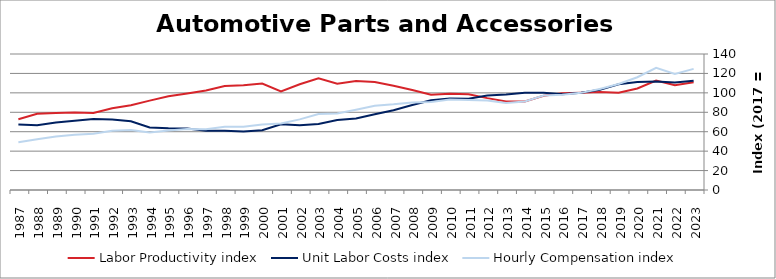
| Category | Labor Productivity index | Unit Labor Costs index | Hourly Compensation index |
|---|---|---|---|
| 2023.0 | 110.968 | 112.347 | 124.669 |
| 2022.0 | 107.852 | 110.727 | 119.422 |
| 2021.0 | 112.573 | 111.803 | 125.86 |
| 2020.0 | 104.532 | 111.051 | 116.083 |
| 2019.0 | 100.223 | 108.815 | 109.057 |
| 2018.0 | 100.858 | 103.092 | 103.976 |
| 2017.0 | 100 | 100 | 100 |
| 2016.0 | 99.548 | 98.443 | 97.998 |
| 2015.0 | 97.015 | 100.215 | 97.224 |
| 2014.0 | 91.045 | 99.992 | 91.038 |
| 2013.0 | 91.18 | 98.334 | 89.661 |
| 2012.0 | 94.582 | 97.313 | 92.04 |
| 2011.0 | 98.626 | 93.83 | 92.541 |
| 2010.0 | 98.953 | 94.229 | 93.243 |
| 2009.0 | 98.142 | 92.419 | 90.702 |
| 2008.0 | 102.962 | 87.468 | 90.059 |
| 2007.0 | 107.335 | 82.13 | 88.154 |
| 2006.0 | 111.146 | 77.99 | 86.683 |
| 2005.0 | 112.198 | 73.596 | 82.574 |
| 2004.0 | 109.306 | 72.107 | 78.817 |
| 2003.0 | 115.047 | 68.008 | 78.242 |
| 2002.0 | 108.844 | 66.768 | 72.673 |
| 2001.0 | 101.453 | 67.562 | 68.544 |
| 2000.0 | 109.631 | 61.44 | 67.357 |
| 1999.0 | 107.818 | 60.278 | 64.99 |
| 1998.0 | 107.107 | 60.872 | 65.199 |
| 1997.0 | 102.352 | 61.097 | 62.534 |
| 1996.0 | 99.255 | 63.211 | 62.74 |
| 1995.0 | 96.559 | 63.523 | 61.337 |
| 1994.0 | 92.007 | 64.298 | 59.159 |
| 1993.0 | 87.246 | 70.753 | 61.729 |
| 1992.0 | 84.169 | 72.547 | 61.062 |
| 1991.0 | 79.23 | 73.186 | 57.985 |
| 1990.0 | 79.728 | 71.409 | 56.933 |
| 1989.0 | 79.226 | 69.598 | 55.14 |
| 1988.0 | 78.413 | 66.623 | 52.241 |
| 1987.0 | 72.787 | 67.508 | 49.137 |